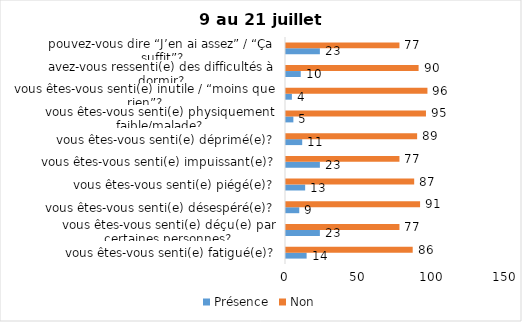
| Category | Présence | Non |
|---|---|---|
| vous êtes-vous senti(e) fatigué(e)? | 14 | 86 |
| vous êtes-vous senti(e) déçu(e) par certaines personnes? | 23 | 77 |
| vous êtes-vous senti(e) désespéré(e)? | 9 | 91 |
| vous êtes-vous senti(e) piégé(e)? | 13 | 87 |
| vous êtes-vous senti(e) impuissant(e)? | 23 | 77 |
| vous êtes-vous senti(e) déprimé(e)? | 11 | 89 |
| vous êtes-vous senti(e) physiquement faible/malade? | 5 | 95 |
| vous êtes-vous senti(e) inutile / “moins que rien”? | 4 | 96 |
| avez-vous ressenti(e) des difficultés à dormir? | 10 | 90 |
| pouvez-vous dire “J’en ai assez” / “Ça suffit”? | 23 | 77 |